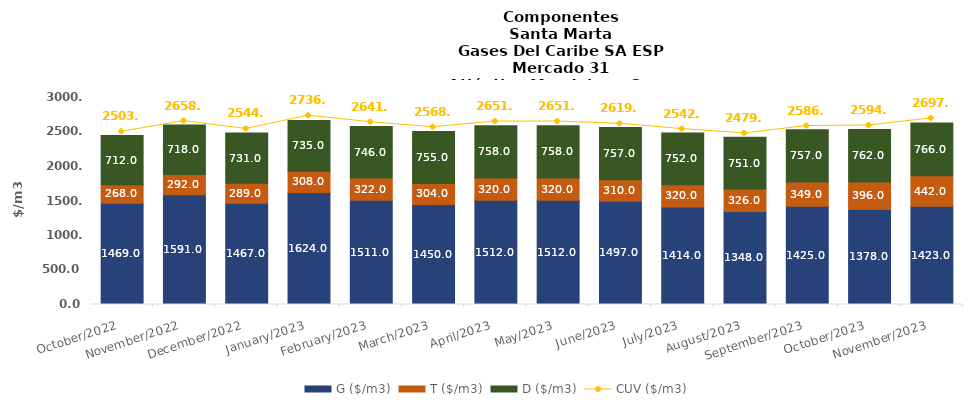
| Category | G ($/m3) | T ($/m3) | D ($/m3) |
|---|---|---|---|
| 2022-10-01 | 1469 | 268 | 712 |
| 2022-11-01 | 1591 | 292 | 718 |
| 2022-12-01 | 1467 | 289 | 731 |
| 2023-01-01 | 1624 | 308 | 735 |
| 2023-02-01 | 1511 | 322 | 746 |
| 2023-03-01 | 1450 | 304 | 755 |
| 2023-04-01 | 1512 | 320 | 758 |
| 2023-05-01 | 1512 | 320 | 758 |
| 2023-06-01 | 1497 | 310 | 757 |
| 2023-07-01 | 1414 | 320 | 752 |
| 2023-08-01 | 1348 | 326 | 751 |
| 2023-09-01 | 1425 | 349 | 757 |
| 2023-10-01 | 1378 | 396 | 762 |
| 2023-11-01 | 1423 | 442 | 766 |